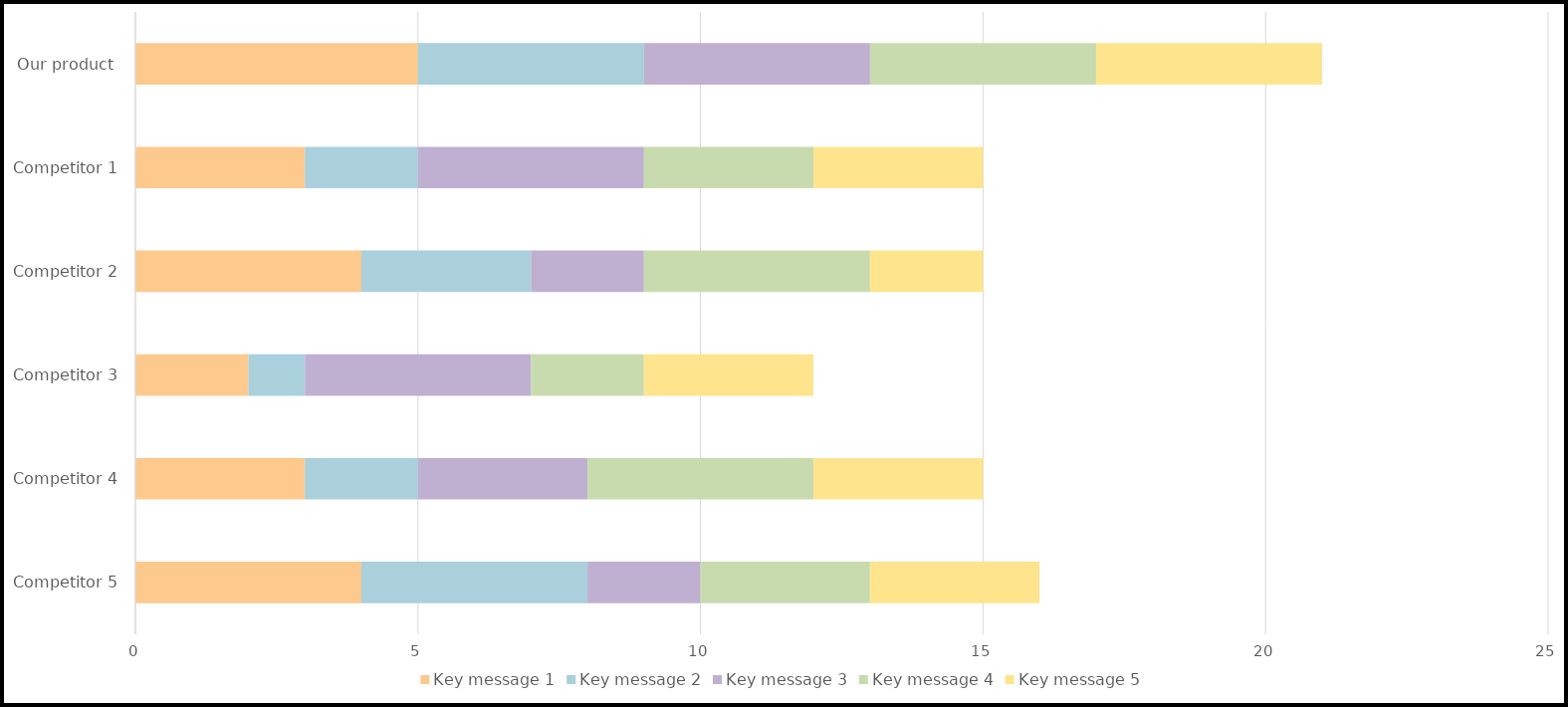
| Category | Key message 1 | Key message 2 | Key message 3 | Key message 4 | Key message 5 |
|---|---|---|---|---|---|
| Competitor 5 | 4 | 4 | 2 | 3 | 3 |
| Competitor 4 | 3 | 2 | 3 | 4 | 3 |
| Competitor 3 | 2 | 1 | 4 | 2 | 3 |
| Competitor 2 | 4 | 3 | 2 | 4 | 2 |
| Competitor 1 | 3 | 2 | 4 | 3 | 3 |
| Our product  | 5 | 4 | 4 | 4 | 4 |